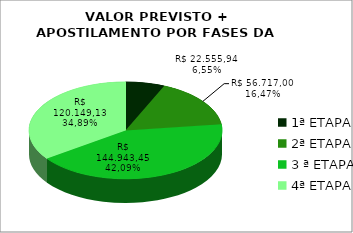
| Category | Series 0 | Series 1 |
|---|---|---|
| 1ª ETAPA | 0.066 |  |
| 2ª ETAPA | 0.165 |  |
| 3 ª ETAPA | 0.421 |  |
| 4ª ETAPA | 0.349 |  |